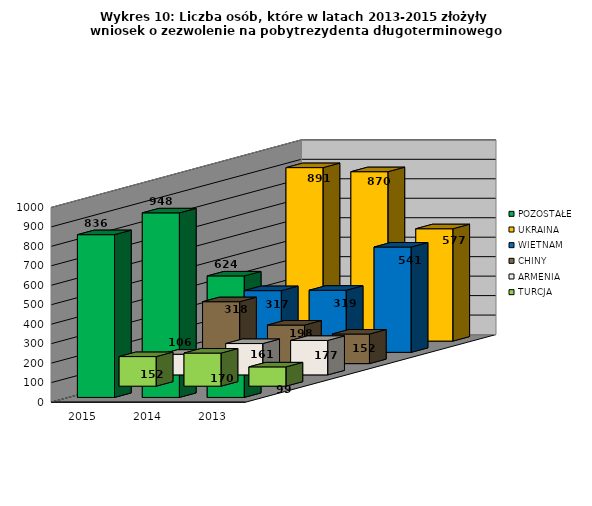
| Category | POZOSTAŁE | UKRAINA | WIETNAM | CHINY | ARMENIA | TURCJA |
|---|---|---|---|---|---|---|
| 2013.0 | 624 | 577 | 541 | 152 | 177 | 99 |
| 2014.0 | 948 | 870 | 319 | 198 | 161 | 170 |
| 2015.0 | 836 | 891 | 317 | 318 | 106 | 152 |